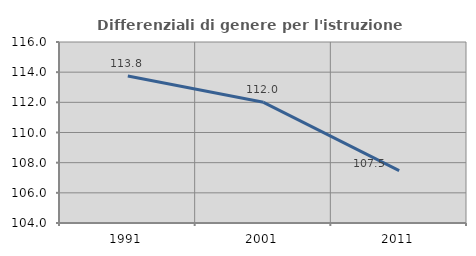
| Category | Differenziali di genere per l'istruzione superiore |
|---|---|
| 1991.0 | 113.75 |
| 2001.0 | 112.003 |
| 2011.0 | 107.467 |